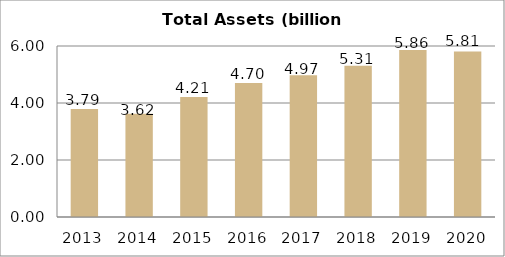
| Category | Series 1 |
|---|---|
| 2013.0 | 3.79 |
| 2014.0 | 3.62 |
| 2015.0 | 4.21 |
| 2016.0 | 4.7 |
| 2017.0 | 4.97 |
| 2018.0 | 5.31 |
| 2019.0 | 5.86 |
| 2020.0 | 5.81 |